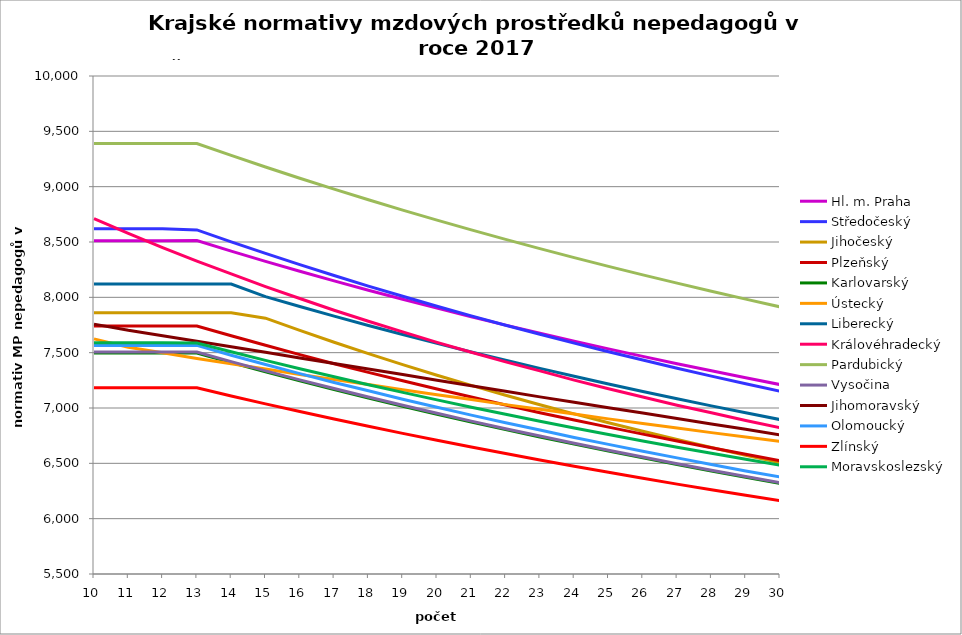
| Category | Hl. m. Praha | Středočeský | Jihočeský | Plzeňský | Karlovarský  | Ústecký   | Liberecký | Královéhradecký | Pardubický | Vysočina | Jihomoravský | Olomoucký | Zlínský | Moravskoslezský |
|---|---|---|---|---|---|---|---|---|---|---|---|---|---|---|
| 10.0 | 8511.038 | 8619.444 | 7860.65 | 7740.718 | 7496.677 | 7624.648 | 8120.322 | 8711.522 | 9389.89 | 7505.184 | 7757.725 | 7565.608 | 7182.125 | 7589.077 |
| 11.0 | 8511.038 | 8619.444 | 7860.65 | 7740.718 | 7496.677 | 7548.235 | 8120.322 | 8578.076 | 9389.89 | 7505.184 | 7702.149 | 7565.608 | 7182.125 | 7589.077 |
| 12.0 | 8511.038 | 8619.444 | 7860.65 | 7740.718 | 7496.677 | 7499.221 | 8120.322 | 8448.656 | 9389.89 | 7505.184 | 7653.769 | 7565.608 | 7182.125 | 7589.077 |
| 13.0 | 8512.477 | 8608.982 | 7860.65 | 7740.718 | 7496.743 | 7447.635 | 8120.394 | 8326.952 | 9389.974 | 7505.184 | 7602.829 | 7565.608 | 7182.125 | 7587.935 |
| 14.0 | 8417.493 | 8501.059 | 7860.65 | 7652.562 | 7410.717 | 7399.915 | 8120.486 | 8212.466 | 9282.221 | 7419.061 | 7552.562 | 7476.601 | 7108.883 | 7508.208 |
| 15.0 | 8325.293 | 8396.528 | 7811.908 | 7566.392 | 7327.213 | 7352.801 | 8006.101 | 8097.424 | 9177.63 | 7335.527 | 7502.956 | 7392.848 | 7037.608 | 7430.687 |
| 16.0 | 8235.765 | 8295.239 | 7700.734 | 7482.141 | 7246.129 | 7303.204 | 7916.739 | 7989.122 | 9076.068 | 7254.475 | 7450.958 | 7310.95 | 6968.226 | 7355.289 |
| 17.0 | 8148.801 | 8197.05 | 7593.781 | 7399.746 | 7167.366 | 7257.31 | 7829.951 | 7883.678 | 8977.415 | 7175.499 | 7402.673 | 7230.847 | 6900.669 | 7281.932 |
| 18.0 | 8064.301 | 8101.828 | 7490.831 | 7322.213 | 7090.831 | 7211.99 | 7745.635 | 7784.361 | 8881.552 | 7098.818 | 7352.051 | 7155.463 | 6834.869 | 7210.541 |
| 19.0 | 7982.168 | 8009.447 | 7391.679 | 7246.288 | 7016.438 | 7164.268 | 7663.692 | 7687.516 | 8788.372 | 7024.342 | 7302.117 | 7078.713 | 6770.764 | 7141.042 |
| 20.0 | 7902.311 | 7919.79 | 7296.134 | 7171.921 | 6944.102 | 7120.099 | 7584.03 | 7593.051 | 8697.768 | 6951.982 | 7249.98 | 7006.452 | 6708.294 | 7073.368 |
| 21.0 | 7824.645 | 7832.743 | 7204.02 | 7099.065 | 6873.746 | 7076.471 | 7506.56 | 7504.02 | 8609.644 | 6881.658 | 7201.418 | 6935.651 | 6647.401 | 7007.452 |
| 22.0 | 7749.087 | 7748.202 | 7115.171 | 7027.675 | 6805.293 | 7030.519 | 7431.199 | 7417.053 | 8523.904 | 6813.015 | 7150.704 | 6866.267 | 6588.032 | 6943.233 |
| 23.0 | 7675.559 | 7666.066 | 7029.43 | 6957.706 | 6738.673 | 6987.979 | 7357.868 | 7335.08 | 8440.46 | 6746.266 | 7100.699 | 6800.951 | 6530.134 | 6880.65 |
| 24.0 | 7603.988 | 7586.241 | 6946.654 | 6891.834 | 6673.819 | 6945.95 | 7286.491 | 7251.963 | 8359.228 | 6681.339 | 7051.389 | 6734.223 | 6473.657 | 6819.648 |
| 25.0 | 7534.304 | 7508.636 | 6866.705 | 6827.198 | 6610.666 | 6901.673 | 7216.998 | 7173.579 | 8280.126 | 6618.168 | 7002.759 | 6671.384 | 6418.556 | 6760.172 |
| 26.0 | 7466.438 | 7433.166 | 6789.457 | 6763.763 | 6549.153 | 6860.673 | 7149.319 | 7099.683 | 8203.079 | 6556.687 | 6954.795 | 6609.707 | 6364.783 | 6702.171 |
| 27.0 | 7400.328 | 7359.751 | 6714.789 | 6701.496 | 6489.223 | 6820.157 | 7083.391 | 7024.539 | 8128.014 | 6496.587 | 6904.873 | 6549.16 | 6312.297 | 6645.595 |
| 28.0 | 7335.914 | 7288.315 | 6642.588 | 6640.365 | 6430.819 | 6777.465 | 7019.152 | 6956.366 | 8054.861 | 6438.068 | 6855.664 | 6489.713 | 6261.056 | 6590.399 |
| 29.0 | 7273.136 | 7218.783 | 6572.749 | 6582.818 | 6373.89 | 6737.923 | 6956.542 | 6886.856 | 7983.554 | 6381.074 | 6807.151 | 6431.334 | 6211.02 | 6536.536 |
| 30.0 | 7211.94 | 7151.088 | 6505.173 | 6523.824 | 6318.384 | 6698.84 | 6895.506 | 6821.317 | 7914.031 | 6325.554 | 6756.821 | 6376.366 | 6162.151 | 6483.964 |